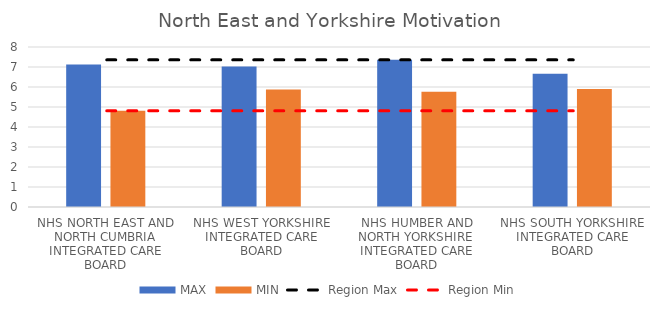
| Category | MAX | MIN |
|---|---|---|
| NHS NORTH EAST AND NORTH CUMBRIA INTEGRATED CARE BOARD | 7.12 | 4.812 |
| NHS WEST YORKSHIRE INTEGRATED CARE BOARD | 7.022 | 5.879 |
| NHS HUMBER AND NORTH YORKSHIRE INTEGRATED CARE BOARD | 7.358 | 5.766 |
| NHS SOUTH YORKSHIRE INTEGRATED CARE BOARD | 6.667 | 5.901 |